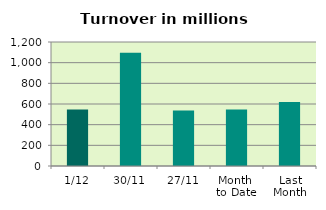
| Category | Series 0 |
|---|---|
| 1/12 | 547.807 |
| 30/11 | 1095.015 |
| 27/11 | 536.305 |
| Month 
to Date | 547.807 |
| Last
Month | 619.399 |